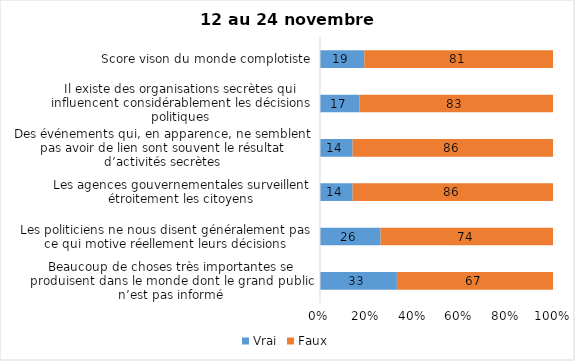
| Category | Vrai | Faux |
|---|---|---|
| Beaucoup de choses très importantes se produisent dans le monde dont le grand public n’est pas informé | 33 | 67 |
| Les politiciens ne nous disent généralement pas ce qui motive réellement leurs décisions | 26 | 74 |
| Les agences gouvernementales surveillent étroitement les citoyens | 14 | 86 |
| Des événements qui, en apparence, ne semblent pas avoir de lien sont souvent le résultat d’activités secrètes | 14 | 86 |
| Il existe des organisations secrètes qui influencent considérablement les décisions politiques | 17 | 83 |
| Score vison du monde complotiste | 19 | 81 |